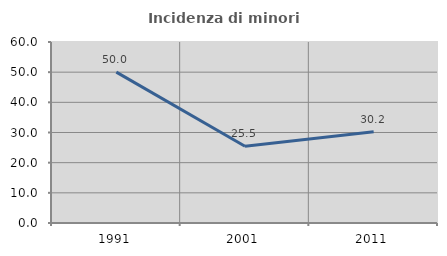
| Category | Incidenza di minori stranieri |
|---|---|
| 1991.0 | 50 |
| 2001.0 | 25.455 |
| 2011.0 | 30.222 |